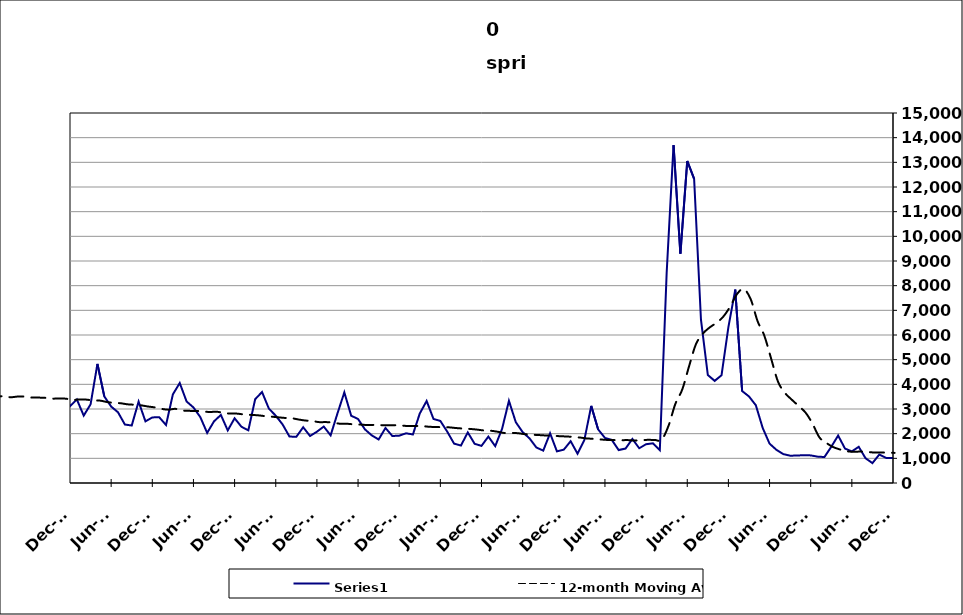
| Category | Series 0 |
|---|---|
| 2005-05-31 | 3131 |
| 2005-06-30 | 2953 |
| 2005-07-31 | 2452 |
| 2005-08-31 | 1842 |
| 2005-09-30 | 1444 |
| 2005-10-31 | 2141 |
| 2005-11-30 | 1626 |
| 2005-12-31 | 1998 |
| 2006-01-31 | 1588 |
| 2006-02-28 | 1445 |
| 2006-03-31 | 1949 |
| 2006-04-30 | 2959 |
| 2006-05-31 | 2381 |
| 2006-06-30 | 2220 |
| 2006-07-31 | 2123 |
| 2006-08-31 | 1525 |
| 2006-09-30 | 1615 |
| 2006-10-31 | 1860 |
| 2006-11-30 | 1507 |
| 2006-12-31 | 1965 |
| 2007-01-31 | 2023 |
| 2007-02-28 | 1616 |
| 2007-03-31 | 2671 |
| 2007-04-30 | 3721 |
| 2007-05-31 | 2286 |
| 2007-06-30 | 3372 |
| 2007-07-30 | 2459 |
| 2007-08-31 | 1980 |
| 2007-09-30 | 2331 |
| 2007-10-31 | 2490 |
| 2007-11-15 | 1970 |
| 2007-12-15 09:36:00 | 2318 |
| 2008-01-14 19:12:00 | 2557 |
| 2008-02-14 04:48:00 | 2676 |
| 2008-03-15 14:24:00 | 3345 |
| 2008-04-15 | 4771 |
| 2008-05-15 09:36:00 | 3529 |
| 2008-06-14 19:12:00 | 4044 |
| 2008-07-15 04:48:00 | 3468 |
| 2008-08-14 14:24:00 | 2936 |
| 2008-09-14 | 3327 |
| 2008-10-14 09:36:00 | 4398 |
| 2008-11-13 19:12:00 | 4288 |
| 2008-12-14 04:48:00 | 4919 |
| 2009-01-13 14:24:00 | 4529 |
| 2009-02-13 | 4588 |
| 2009-03-15 09:36:00 | 6230 |
| 2009-04-14 19:12:00 | 6528 |
| 2009-05-15 04:48:00 | 5710 |
| 2009-06-14 14:24:00 | 5729 |
| 2009-07-15 | 5181 |
| 2009-08-14 09:36:00 | 4471 |
| 2009-09-13 19:12:00 | 4514 |
| 2009-10-14 04:48:00 | 4928 |
| 2009-11-13 14:24:00 | 4288 |
| 2009-12-14 | 4919 |
| 2010-01-13 09:36:00 | 4406 |
| 2010-02-12 19:12:00 | 3451 |
| 2010-03-15 04:48:00 | 4910 |
| 2010-04-14 14:24:00 | 5413 |
| 2010-05-15 | 4664 |
| 2010-06-14 09:36:00 | 4652 |
| 2010-07-14 19:12:00 | 3833 |
| 2010-08-14 04:48:00 | 3333 |
| 2010-09-13 14:24:00 | 3073 |
| 2010-10-14 | 3708 |
| 2010-11-13 09:36:00 | 3510 |
| 2010-12-13 19:12:00 | 3680 |
| 2011-01-13 04:48:00 | 3314 |
| 2011-02-12 14:24:00 | 2671 |
| 2011-03-15 | 4059 |
| 2011-04-14 09:36:00 | 4574 |
| 2011-05-14 19:12:00 | 4200 |
| 2011-06-14 04:48:00 | 4010 |
| 2011-07-14 14:24:00 | 3058 |
| 2011-08-14 | 3003 |
| 2011-09-13 09:36:00 | 2938 |
| 2011-10-13 19:12:00 | 3534 |
| 2011-11-13 04:48:00 | 3132 |
| 2011-12-13 14:24:00 | 3706 |
| 2012-01-13 | 3182 |
| 2012-02-12 09:36:00 | 2802 |
| 2012-03-13 19:12:00 | 3584 |
| 2012-04-13 04:48:00 | 4909 |
| 2012-05-13 14:24:00 | 4188 |
| 2012-06-13 | 3531 |
| 2012-07-13 09:36:00 | 3044 |
| 2012-08-12 19:12:00 | 2885 |
| 2012-09-12 04:48:00 | 2556 |
| 2012-10-12 14:24:00 | 3582 |
| 2012-11-12 | 3054 |
| 2012-12-12 09:36:00 | 3117 |
| 2013-01-11 19:12:00 | 3385 |
| 2013-02-11 04:48:00 | 2732 |
| 2013-03-13 14:24:00 | 3189 |
| 2013-04-13 | 4828 |
| 2013-05-13 09:36:00 | 3513 |
| 2013-06-12 19:12:00 | 3099 |
| 2013-07-13 04:48:00 | 2867 |
| 2013-08-12 14:24:00 | 2371 |
| 2013-09-12 | 2330 |
| 2013-10-12 09:36:00 | 3301 |
| 2013-11-11 19:12:00 | 2499 |
| 2013-12-12 04:48:00 | 2658 |
| 2014-01-11 14:24:00 | 2669 |
| 2014-02-11 | 2351 |
| 2014-03-13 09:36:00 | 3592 |
| 2014-04-12 19:12:00 | 4054 |
| 2014-05-13 04:48:00 | 3305 |
| 2014-06-12 14:24:00 | 3062 |
| 2014-07-13 | 2671 |
| 2014-08-12 09:36:00 | 2031 |
| 2014-09-11 19:12:00 | 2501 |
| 2014-10-12 04:48:00 | 2759 |
| 2014-11-11 14:24:00 | 2132 |
| 2014-12-12 | 2624 |
| 2015-01-11 09:36:00 | 2280 |
| 2015-02-10 19:12:00 | 2135 |
| 2015-03-13 04:48:00 | 3396 |
| 2015-04-12 14:24:00 | 3689 |
| 2015-05-13 | 3015 |
| 2015-06-12 09:36:00 | 2729 |
| 2015-07-12 19:12:00 | 2373 |
| 2015-08-12 04:48:00 | 1884 |
| 2015-09-11 14:24:00 | 1872 |
| 2015-10-12 | 2261 |
| 2015-11-11 09:36:00 | 1906 |
| 2015-12-11 19:12:00 | 2079 |
| 2016-01-11 04:48:00 | 2289 |
| 2016-02-10 14:24:00 | 1931 |
| 2016-03-12 | 2822 |
| 2016-04-11 09:36:00 | 3674 |
| 2016-05-11 19:12:00 | 2728 |
| 2016-06-11 04:48:00 | 2594 |
| 2016-07-11 14:24:00 | 2175 |
| 2016-08-11 | 1931 |
| 2016-09-10 09:36:00 | 1765 |
| 2016-10-10 19:12:00 | 2230 |
| 2016-11-10 04:48:00 | 1905 |
| 2016-12-10 14:24:00 | 1919 |
| 2017-01-10 | 2015 |
| 2017-02-09 09:36:00 | 1968 |
| 2017-03-11 19:12:00 | 2817 |
| 2017-04-11 04:48:00 | 3325 |
| 2017-05-11 14:24:00 | 2596 |
| 2017-06-11 | 2516 |
| 2017-07-11 09:36:00 | 2084 |
| 2017-08-10 19:12:00 | 1597 |
| 2017-09-10 04:48:00 | 1518 |
| 2017-10-10 14:24:00 | 2050 |
| 2017-11-10 | 1589 |
| 2017-12-10 09:36:00 | 1505 |
| 2018-01-09 19:12:00 | 1882 |
| 2018-02-09 04:48:00 | 1495 |
| 2018-03-11 14:24:00 | 2194 |
| 2018-04-11 | 3332 |
| 2018-05-11 09:36:00 | 2466 |
| 2018-06-10 19:12:00 | 2063 |
| 2018-07-11 04:48:00 | 1809 |
| 2018-08-10 14:24:00 | 1440 |
| 2018-09-10 | 1313 |
| 2018-10-10 09:36:00 | 2015 |
| 2018-11-09 19:12:00 | 1282 |
| 2018-12-10 04:48:00 | 1351 |
| 2019-01-09 14:24:00 | 1695 |
| 2019-02-09 | 1189 |
| 2019-03-11 09:36:00 | 1746 |
| 2019-04-10 19:12:00 | 3126 |
| 2019-05-11 04:48:00 | 2174 |
| 2019-06-10 14:24:00 | 1827 |
| 2019-07-11 | 1744 |
| 2019-08-10 09:36:00 | 1335 |
| 2019-09-09 19:12:00 | 1398 |
| 2019-10-10 04:48:00 | 1790 |
| 2019-11-09 14:24:00 | 1407 |
| 2019-12-10 | 1573 |
| 2020-01-09 09:36:00 | 1610 |
| 2020-02-08 19:12:00 | 1333 |
| 2020-03-10 04:48:00 | 8532 |
| 2020-04-09 14:24:00 | 13699 |
| 2020-05-10 | 9300 |
| 2020-06-09 09:36:00 | 13055 |
| 2020-07-09 19:12:00 | 12333 |
| 2020-08-09 04:48:00 | 6620 |
| 2020-09-08 14:24:00 | 4377 |
| 2020-10-09 | 4142 |
| 2020-11-08 09:36:00 | 4370 |
| 2020-12-08 19:12:00 | 6320 |
| 2021-01-08 04:48:00 | 7842 |
| 2021-02-07 14:24:00 | 3728 |
| 2021-03-10 | 3509 |
| 2021-04-09 09:36:00 | 3153 |
| 2021-05-09 19:12:00 | 2232 |
| 2021-06-09 04:48:00 | 1596 |
| 2021-07-09 14:24:00 | 1345 |
| 2021-08-09 | 1172 |
| 2021-09-08 09:36:00 | 1107 |
| 2021-10-08 19:12:00 | 1113 |
| 2021-11-08 04:48:00 | 1129 |
| 2021-12-08 14:24:00 | 1119 |
| 2022-01-08 | 1069 |
| 2022-02-07 09:36:00 | 1053 |
| 2022-03-09 19:12:00 | 1468 |
| 2022-04-09 04:48:00 | 1924 |
| 2022-05-09 14:24:00 | 1396 |
| 2022-06-09 | 1281 |
| 2022-07-09 09:36:00 | 1468 |
| 2022-08-08 19:12:00 | 1003 |
| 2022-09-08 04:48:00 | 806 |
| 2022-10-08 14:24:00 | 1152 |
| 2022-11-08 | 1018 |
| 2022-12-08 09:36:00 | 1012 |